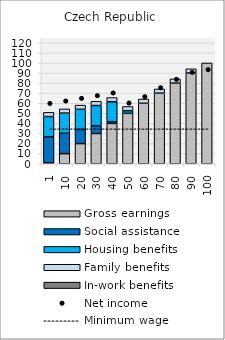
| Category | Gross earnings | Social assistance | Housing benefits | Family benefits | In-work benefits |
|---|---|---|---|---|---|
| 1.0 | 1 | 25.832 | 20 | 4.173 | 0 |
| 10.0 | 10 | 20.225 | 20 | 4.173 | 0 |
| 20.0 | 20 | 13.995 | 20 | 4.173 | 0 |
| 30.0 | 30 | 7.765 | 20 | 4.173 | 0 |
| 40.0 | 40 | 1.535 | 20 | 4.173 | 0 |
| 50.0 | 50 | 0 | 2.653 | 4.173 | 0 |
| 60.0 | 60 | 0 | 0 | 4.173 | 0 |
| 70.0 | 70 | 0 | 0 | 4.173 | 0 |
| 80.0 | 80 | 0 | 0 | 4.173 | 0 |
| 90.0 | 90 | 0 | 0 | 4.173 | 0 |
| 100.0 | 100 | 0 | 0 | 0 | 0 |